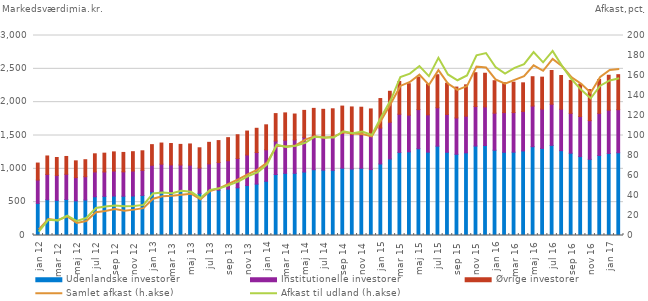
| Category | Udenlandske investorer | Institutionelle investorer | Øvrige investorer |
|---|---|---|---|
| jan 12 | 481.708 | 350.614 | 254.309 |
| feb 12 | 536.636 | 379.675 | 276.595 |
| mar 12 | 527.634 | 374.005 | 268.568 |
| apr 12 | 540.75 | 378.302 | 266.523 |
| maj 12 | 520.058 | 348.365 | 251.36 |
| jun 12 | 532.933 | 349.163 | 254.641 |
| jul 12 | 580.974 | 372.509 | 271.962 |
| aug 12 | 587.215 | 366.329 | 281.457 |
| sep 12 | 592.041 | 375.089 | 287.133 |
| okt 12 | 588.954 | 366.275 | 290.746 |
| nov 12 | 592.819 | 374.449 | 289.859 |
| dec 12 | 600.721 | 377.209 | 292.77 |
| jan 13 | 655.273 | 398.213 | 309.425 |
| feb 13 | 662.555 | 407.49 | 316.944 |
| mar 13 | 653.522 | 405.413 | 320.656 |
| apr 13 | 661.244 | 396.287 | 309.02 |
| maj 13 | 659.235 | 396.134 | 317.695 |
| jun 13 | 632.287 | 380.571 | 303.097 |
| jul 13 | 670.618 | 404.255 | 322.71 |
| aug 13 | 679.084 | 415.102 | 329.594 |
| sep 13 | 695.279 | 426.279 | 346.212 |
| okt 13 | 715.679 | 440.202 | 355.662 |
| nov 13 | 750.223 | 457.468 | 359.101 |
| dec 13 | 770.953 | 474.349 | 363.007 |
| jan 14 | 813.78 | 471.514 | 374.961 |
| feb 14 | 914.446 | 502.269 | 411.836 |
| mar 14 | 932.436 | 496.393 | 410.382 |
| apr 14 | 932.818 | 500.595 | 388.747 |
| maj 14 | 951.629 | 520.84 | 404.397 |
| jun 14 | 986.529 | 515.509 | 404.831 |
| jul 14 | 980.214 | 508.745 | 403.692 |
| aug 14 | 977.678 | 517.242 | 405.611 |
| sep 14 | 1009.214 | 521.383 | 410.62 |
| okt 14 | 997.096 | 517.872 | 413.387 |
| nov 14 | 1007.644 | 502.533 | 414.096 |
| dec 14 | 989.086 | 496.41 | 412.99 |
| jan 15 | 1073.133 | 539.007 | 442.109 |
| feb 15 | 1147.659 | 551.206 | 464.476 |
| mar 15 | 1246.357 | 572.955 | 491.417 |
| apr 15 | 1255.028 | 550.383 | 471.221 |
| maj 15 | 1301.214 | 587.468 | 488.058 |
| jun 15 | 1250.113 | 559.691 | 462.038 |
| jul 15 | 1340.182 | 576.058 | 495.589 |
| aug 15 | 1248.665 | 567.143 | 468.521 |
| sep 15 | 1218.45 | 544.662 | 463.176 |
| okt 15 | 1239.859 | 549.701 | 470.155 |
| nov 15 | 1341.875 | 592.638 | 507.359 |
| dec 15 | 1349.551 | 579.275 | 504.968 |
| jan 16 | 1279.3 | 556.073 | 486.534 |
| feb 16 | 1248.429 | 595.033 | 448.337 |
| mar 16 | 1250.145 | 593.813 | 456.206 |
| apr 16 | 1268.356 | 592.768 | 429.035 |
| maj 16 | 1331.978 | 610.265 | 439.669 |
| jun 16 | 1306.352 | 590.179 | 478.739 |
| jul 16 | 1351.536 | 617.258 | 506.668 |
| aug 16 | 1272.594 | 622.106 | 505.056 |
| sep 16 | 1234.317 | 598.269 | 493.839 |
| okt 16 | 1184.181 | 600.842 | 485.974 |
| nov 16 | 1142.638 | 580.338 | 465.563 |
| dec 16 | 1200.793 | 631.614 | 507.761 |
| jan 17 | 1230.467 | 649.586 | 523.529 |
| feb 17 | 1240.97 | 646.41 | 524.869 |